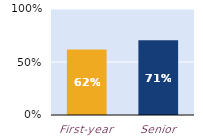
| Category | substantially |
|---|---|
| First-year | 0.619 |
| Senior | 0.706 |